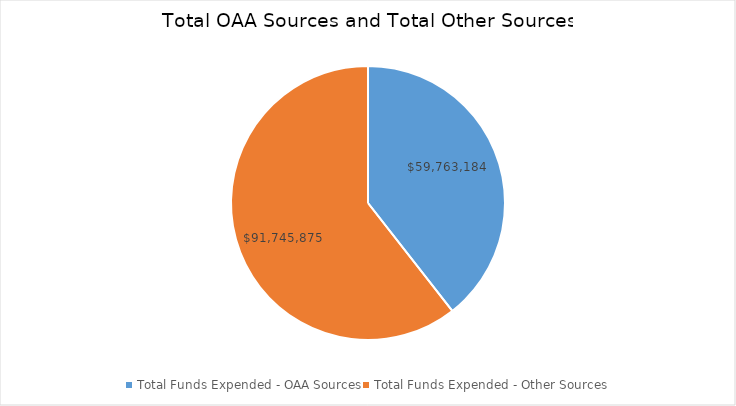
| Category | Series 0 |
|---|---|
| Total Funds Expended - OAA Sources | 59763183.93 |
| Total Funds Expended - Other Sources | 91745874.9 |